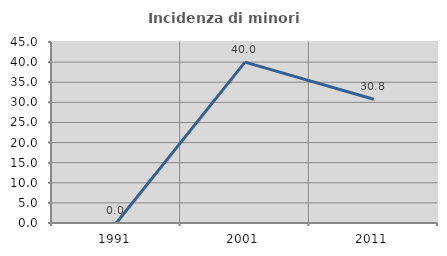
| Category | Incidenza di minori stranieri |
|---|---|
| 1991.0 | 0 |
| 2001.0 | 40 |
| 2011.0 | 30.769 |